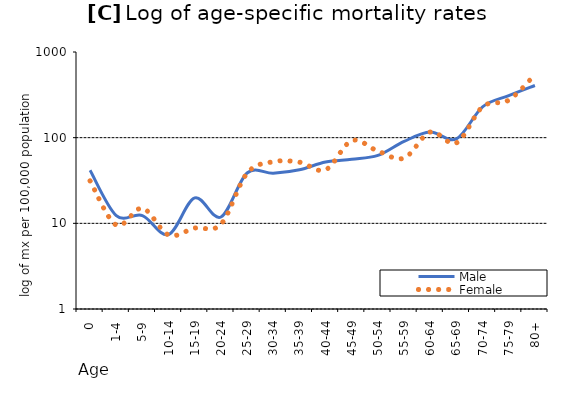
| Category | Male | Female |
|---|---|---|
| 0 | 41.698 | 31.303 |
| 1-4 | 12.321 | 9.547 |
| 5-9 | 12.321 | 15.003 |
| 10-14 | 7.402 | 7.315 |
| 15-19 | 19.819 | 8.808 |
| 20-24 | 11.862 | 9.761 |
| 25-29 | 38.686 | 38.465 |
| 30-34 | 38.32 | 52.353 |
| 35-39 | 42.126 | 51.734 |
| 40-44 | 51.918 | 42.149 |
| 45-49 | 55.984 | 92.319 |
| 50-54 | 62.011 | 69.74 |
| 55-59 | 90.334 | 57.794 |
| 60-64 | 116.24 | 116.248 |
| 65-69 | 96.87 | 86.994 |
| 70-74 | 228.887 | 229.337 |
| 75-79 | 309.273 | 274.556 |
| 80+ | 406.382 | 544.151 |